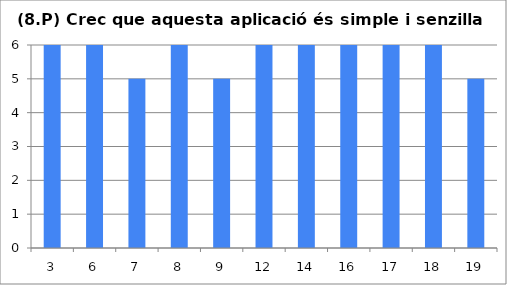
| Category | 8 |
|---|---|
| 3.0 | 6 |
| 6.0 | 6 |
| 7.0 | 5 |
| 8.0 | 6 |
| 9.0 | 5 |
| 12.0 | 6 |
| 14.0 | 6 |
| 16.0 | 6 |
| 17.0 | 6 |
| 18.0 | 6 |
| 19.0 | 5 |